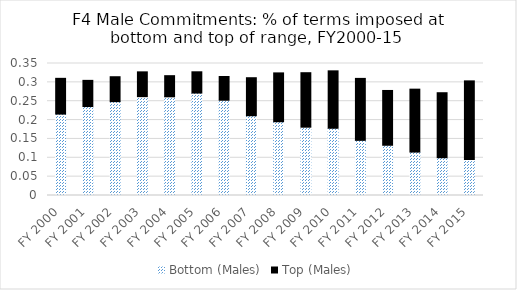
| Category | Bottom (Males) | Top (Males) |
|---|---|---|
| FY 2000 | 0.216 | 0.095 |
| FY 2001 | 0.236 | 0.069 |
| FY 2002 | 0.249 | 0.066 |
| FY 2003 | 0.262 | 0.066 |
| FY 2004 | 0.262 | 0.056 |
| FY 2005 | 0.272 | 0.056 |
| FY 2006 | 0.253 | 0.063 |
| FY 2007 | 0.212 | 0.101 |
| FY 2008 | 0.196 | 0.13 |
| FY 2009 | 0.181 | 0.144 |
| FY 2010 | 0.178 | 0.152 |
| FY 2011 | 0.146 | 0.164 |
| FY 2012 | 0.133 | 0.145 |
| FY 2013 | 0.115 | 0.167 |
| FY 2014 | 0.1 | 0.172 |
| FY 2015 | 0.095 | 0.209 |